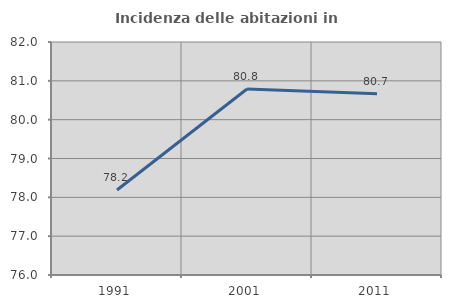
| Category | Incidenza delle abitazioni in proprietà  |
|---|---|
| 1991.0 | 78.189 |
| 2001.0 | 80.791 |
| 2011.0 | 80.665 |